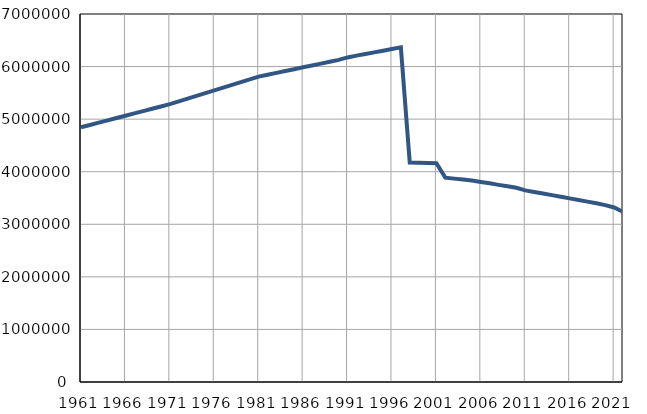
| Category | Број
становника |
|---|---|
| 1961.0 | 4844801 |
| 1962.0 | 4888803 |
| 1963.0 | 4932802 |
| 1964.0 | 4976803 |
| 1965.0 | 5020804 |
| 1966.0 | 5064811 |
| 1967.0 | 5108807 |
| 1968.0 | 5152809 |
| 1969.0 | 5196809 |
| 1970.0 | 5240809 |
| 1971.0 | 5284806 |
| 1972.0 | 5337213 |
| 1973.0 | 5389621 |
| 1974.0 | 5442029 |
| 1975.0 | 5494437 |
| 1976.0 | 5546847 |
| 1977.0 | 5599249 |
| 1978.0 | 5651661 |
| 1979.0 | 5704065 |
| 1980.0 | 5756475 |
| 1981.0 | 5808831 |
| 1982.0 | 5844238 |
| 1983.0 | 5879641 |
| 1984.0 | 5915048 |
| 1985.0 | 5950450 |
| 1986.0 | 5985860 |
| 1987.0 | 6021261 |
| 1988.0 | 6056665 |
| 1989.0 | 6092071 |
| 1990.0 | 6127475 |
| 1991.0 | 6173680 |
| 1992.0 | 6208047 |
| 1993.0 | 6240411 |
| 1994.0 | 6269777 |
| 1995.0 | 6301142 |
| 1996.0 | 6334509 |
| 1997.0 | 6364875 |
| 1998.0 | 4174241 |
| 1999.0 | 4169606 |
| 2000.0 | 4164972 |
| 2001.0 | 4160337 |
| 2002.0 | 3886816 |
| 2003.0 | 3868529 |
| 2004.0 | 3851640 |
| 2005.0 | 3830932 |
| 2006.0 | 3806110 |
| 2007.0 | 3778739 |
| 2008.0 | 3749437 |
| 2009.0 | 3721869 |
| 2010.0 | 3694346 |
| 2011.0 | 3645423 |
| 2012.0 | 3615262 |
| 2013.0 | 3584905 |
| 2014.0 | 3554809 |
| 2015.0 | 3523787 |
| 2016.0 | 3493003 |
| 2017.0 | 3462211 |
| 2018.0 | 3430548 |
| 2019.0 | 3399086 |
| 2020.0 | 3363794 |
| 2021.0 | 3319677 |
| 2022.0 | 3236200 |